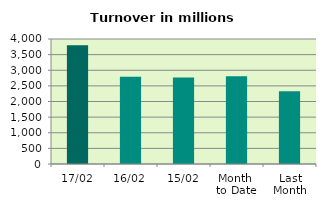
| Category | Series 0 |
|---|---|
| 17/02 | 3797.43 |
| 16/02 | 2791.729 |
| 15/02 | 2771.617 |
| Month 
to Date | 2805.713 |
| Last
Month | 2326.675 |